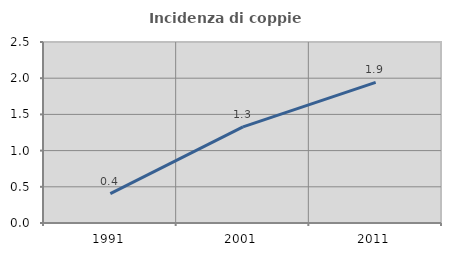
| Category | Incidenza di coppie miste |
|---|---|
| 1991.0 | 0.405 |
| 2001.0 | 1.328 |
| 2011.0 | 1.942 |